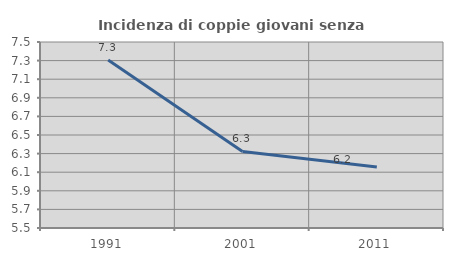
| Category | Incidenza di coppie giovani senza figli |
|---|---|
| 1991.0 | 7.307 |
| 2001.0 | 6.323 |
| 2011.0 | 6.156 |